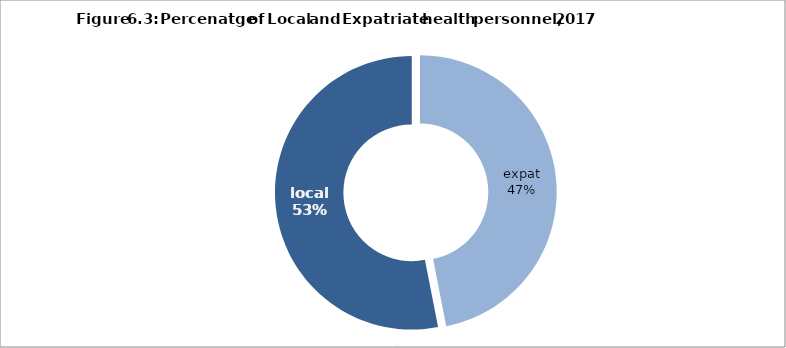
| Category | Series 0 |
|---|---|
| expat | 2201 |
| local | 2490 |